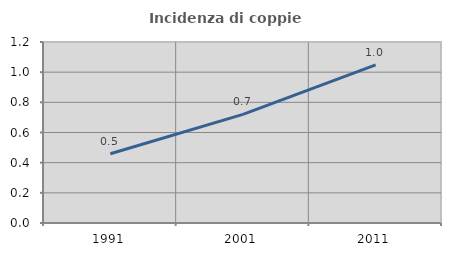
| Category | Incidenza di coppie miste |
|---|---|
| 1991.0 | 0.459 |
| 2001.0 | 0.72 |
| 2011.0 | 1.049 |